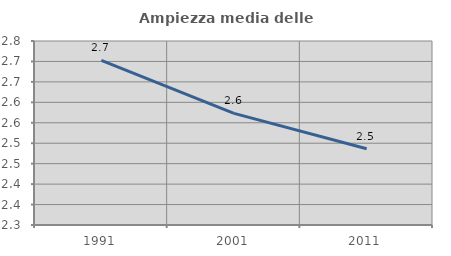
| Category | Ampiezza media delle famiglie |
|---|---|
| 1991.0 | 2.702 |
| 2001.0 | 2.573 |
| 2011.0 | 2.487 |